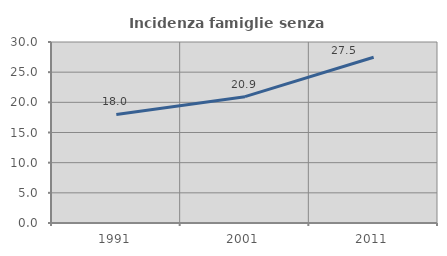
| Category | Incidenza famiglie senza nuclei |
|---|---|
| 1991.0 | 17.988 |
| 2001.0 | 20.944 |
| 2011.0 | 27.477 |